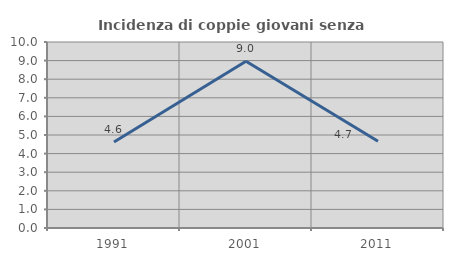
| Category | Incidenza di coppie giovani senza figli |
|---|---|
| 1991.0 | 4.624 |
| 2001.0 | 8.969 |
| 2011.0 | 4.661 |